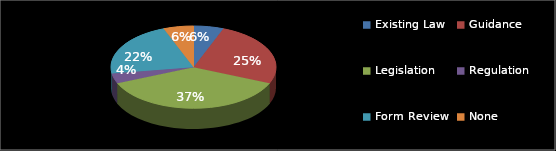
| Category | Series 0 |
|---|---|
| Existing Law | 3 |
| Guidance | 13 |
| Legislation | 19 |
| Regulation | 2 |
| Form Review | 11 |
| None | 3 |